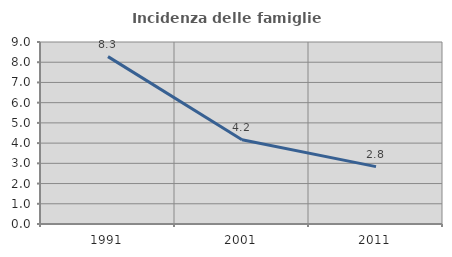
| Category | Incidenza delle famiglie numerose |
|---|---|
| 1991.0 | 8.276 |
| 2001.0 | 4.17 |
| 2011.0 | 2.838 |